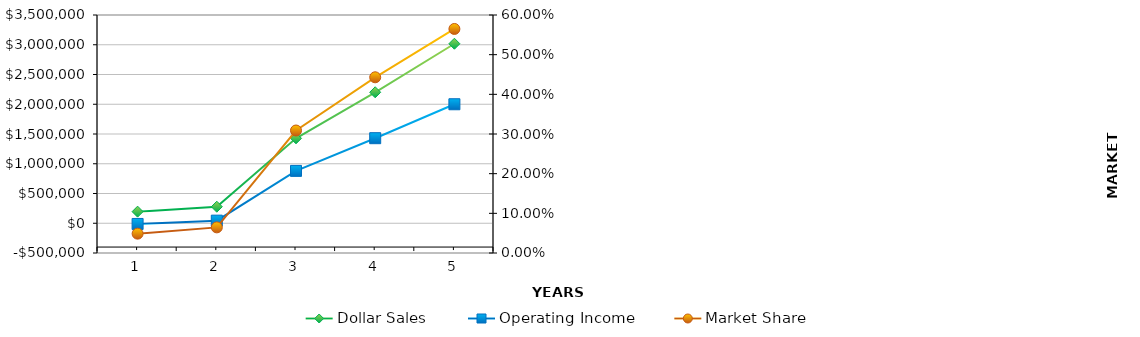
| Category | Dollar Sales | Operating Income |
|---|---|---|
| 0 | 195000 | -12000 |
| 1 | 277708.153 | 43659.544 |
| 2 | 1427419.904 | 879827.854 |
| 3 | 2201081.493 | 1429374.18 |
| 4 | 3016949.033 | 2000000 |